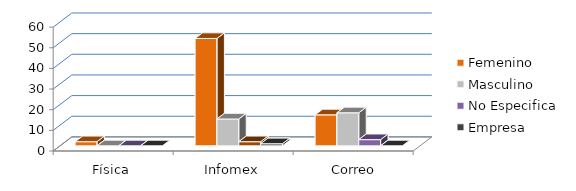
| Category | Femenino | Masculino | No Especifica | Empresa |
|---|---|---|---|---|
| Física | 2 | 0 | 0 | 0 |
| Infomex | 52 | 13 | 2 | 1 |
| Correo Electrónico | 15 | 16 | 3 | 0 |